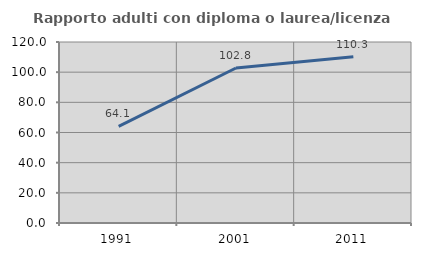
| Category | Rapporto adulti con diploma o laurea/licenza media  |
|---|---|
| 1991.0 | 64.062 |
| 2001.0 | 102.752 |
| 2011.0 | 110.256 |